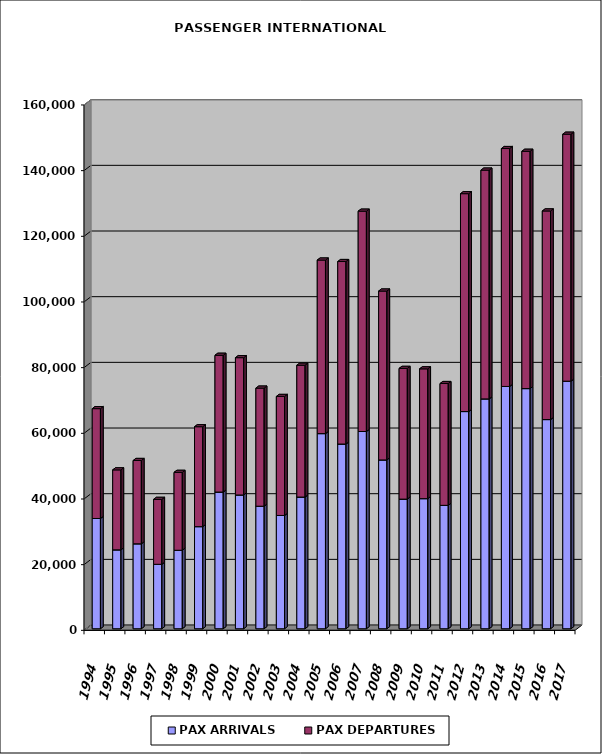
| Category | PAX ARRIVALS | PAX DEPARTURES |
|---|---|---|
| 1994.0 | 33577 | 33453 |
| 1995.0 | 24031 | 24351 |
| 1996.0 | 25874 | 25369 |
| 1997.0 | 19627 | 19773 |
| 1998.0 | 23902 | 23726 |
| 1999.0 | 31098 | 30429 |
| 2000.0 | 41635 | 41647 |
| 2001.0 | 40745 | 41813 |
| 2002.0 | 37317 | 35961 |
| 2003.0 | 34499 | 36246 |
| 2004.0 | 40108 | 40140 |
| 2005.0 | 59432 | 52852 |
| 2006.0 | 56256 | 55579 |
| 2007.0 | 60069 | 67103 |
| 2008.0 | 51417 | 51427 |
| 2009.0 | 39483 | 39808 |
| 2010.0 | 39627 | 39523 |
| 2011.0 | 37583 | 37097 |
| 2012.0 | 66144 | 66353 |
| 2013.0 | 70006 | 69669 |
| 2014.0 | 73786 | 72457 |
| 2015.0 | 73140 | 72270 |
| 2016.0 | 63702 | 63534 |
| 2017.0 | 75401 | 75206 |